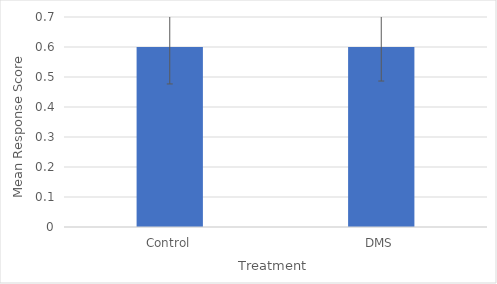
| Category | Series 0 |
|---|---|
| Control | 0.6 |
| DMS | 0.6 |